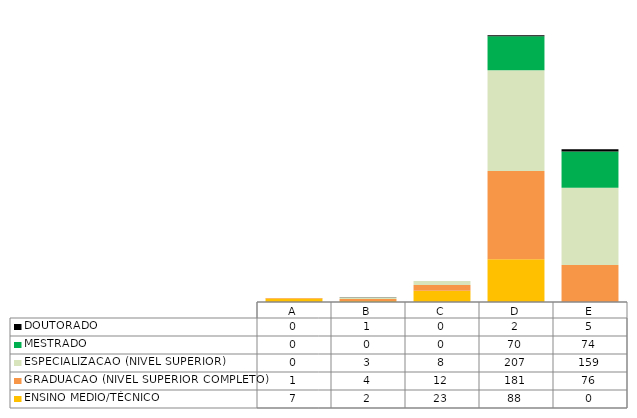
| Category | ENSINO MEDIO/TÉCNICO | GRADUACAO (NIVEL SUPERIOR COMPLETO) | ESPECIALIZACAO (NIVEL SUPERIOR)   | MESTRADO | DOUTORADO                             |
|---|---|---|---|---|---|
| A | 7 | 1 | 0 | 0 | 0 |
| B | 2 | 4 | 3 | 0 | 1 |
| C | 23 | 12 | 8 | 0 | 0 |
| D | 88 | 181 | 207 | 70 | 2 |
| E | 0 | 76 | 159 | 74 | 5 |